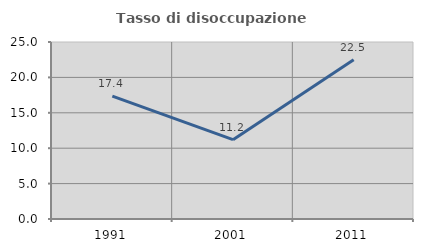
| Category | Tasso di disoccupazione giovanile  |
|---|---|
| 1991.0 | 17.365 |
| 2001.0 | 11.207 |
| 2011.0 | 22.5 |